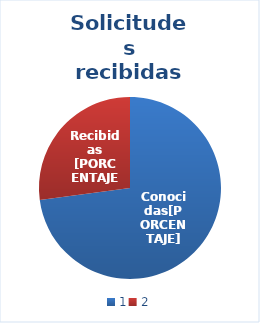
| Category | Series 0 |
|---|---|
| 0 | 35 |
| 1 | 13 |